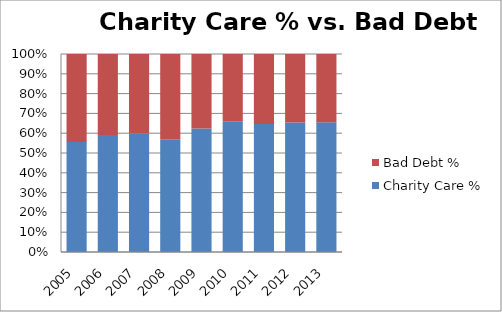
| Category | Charity Care % | Bad Debt % |
|---|---|---|
| 2005.0 | 0.556 | 0.444 |
| 2006.0 | 0.591 | 0.409 |
| 2007.0 | 0.598 | 0.402 |
| 2008.0 | 0.569 | 0.431 |
| 2009.0 | 0.623 | 0.377 |
| 2010.0 | 0.661 | 0.339 |
| 2011.0 | 0.646 | 0.354 |
| 2012.0 | 0.655 | 0.345 |
| 2013.0 | 0.656 | 0.344 |